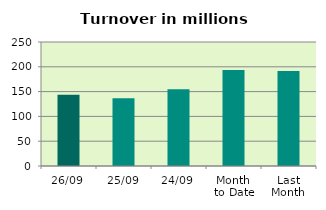
| Category | Series 0 |
|---|---|
| 26/09 | 143.794 |
| 25/09 | 136.347 |
| 24/09 | 154.714 |
| Month 
to Date | 193.312 |
| Last
Month | 191.512 |